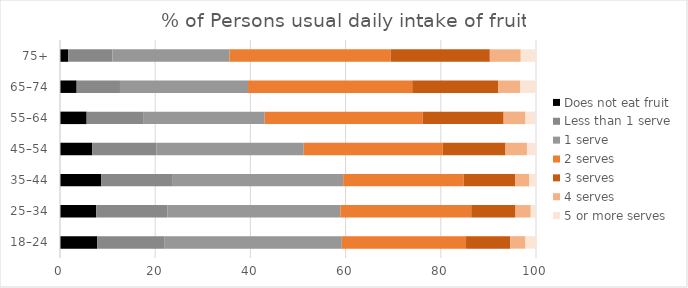
| Category | Does not eat fruit | Less than 1 serve | 1 serve | 2 serves | 3 serves | 4 serves | 5 or more serves  |
|---|---|---|---|---|---|---|---|
| 18–24 | 7.8 | 14.2 | 37.2 | 26.1 | 9.3 | 3.2 | 2.3 |
| 25–34 | 7.6 | 15 | 36.3 | 27.5 | 9.3 | 3.2 | 1 |
| 35–44 | 8.7 | 15 | 35.8 | 25.3 | 10.8 | 3 | 1.4 |
| 45–54 | 6.8 | 13.5 | 30.9 | 29.2 | 13.2 | 4.5 | 1.8 |
| 55–64 | 5.6 | 12 | 25.4 | 33.2 | 17 | 4.6 | 2 |
| 65–74 | 3.5 | 9.1 | 26.9 | 34.5 | 18.1 | 4.6 | 3.3 |
| 75+ | 1.7 | 9.3 | 24.6 | 33.9 | 20.8 | 6.5 | 3.1 |